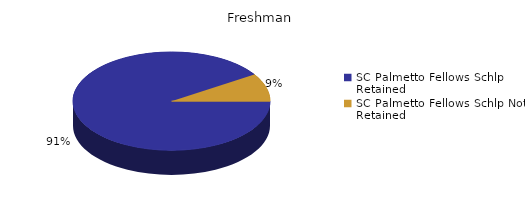
| Category | Freshman |
|---|---|
| SC Palmetto Fellows Schlp Retained  | 369 |
| SC Palmetto Fellows Schlp Not Retained  | 37 |